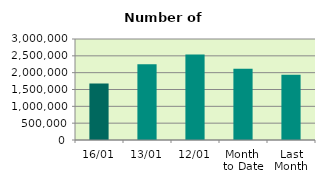
| Category | Series 0 |
|---|---|
| 16/01 | 1676482 |
| 13/01 | 2252820 |
| 12/01 | 2539124 |
| Month 
to Date | 2114072.364 |
| Last
Month | 1934937.048 |